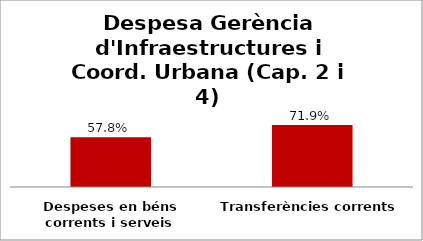
| Category | Series 0 |
|---|---|
| Despeses en béns corrents i serveis | 0.578 |
| Transferències corrents | 0.719 |